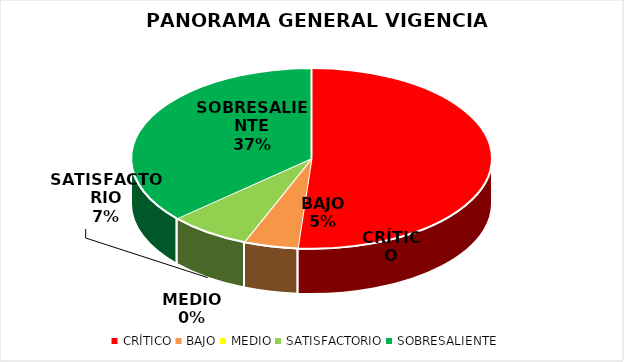
| Category | Series 0 |
|---|---|
| CRÍTICO | 21 |
| BAJO | 2 |
| MEDIO | 0 |
| SATISFACTORIO | 3 |
| SOBRESALIENTE | 15 |